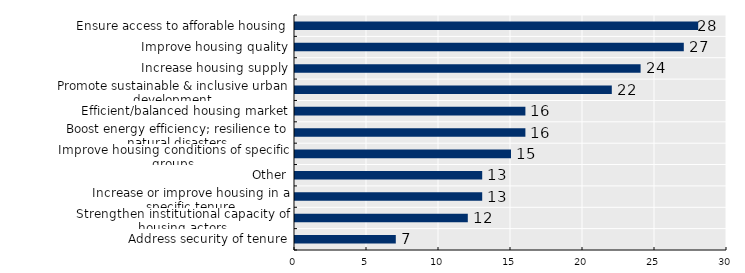
| Category | Series 0 |
|---|---|
| Address security of tenure | 7 |
| Strengthen institutional capacity of housing actors | 12 |
| Increase or improve housing in a specific tenure | 13 |
| Other | 13 |
| Improve housing conditions of specific groups | 15 |
| Boost energy efficiency; resilience to natural disasters | 16 |
| Efficient/balanced housing market | 16 |
| Promote sustainable & inclusive urban development | 22 |
| Increase housing supply | 24 |
| Improve housing quality | 27 |
| Ensure access to afforable housing | 28 |